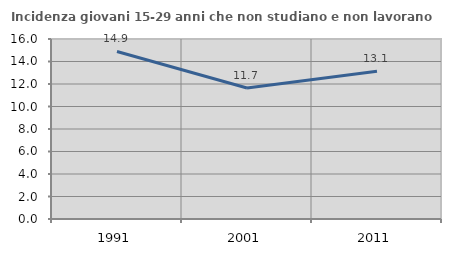
| Category | Incidenza giovani 15-29 anni che non studiano e non lavorano  |
|---|---|
| 1991.0 | 14.894 |
| 2001.0 | 11.65 |
| 2011.0 | 13.127 |